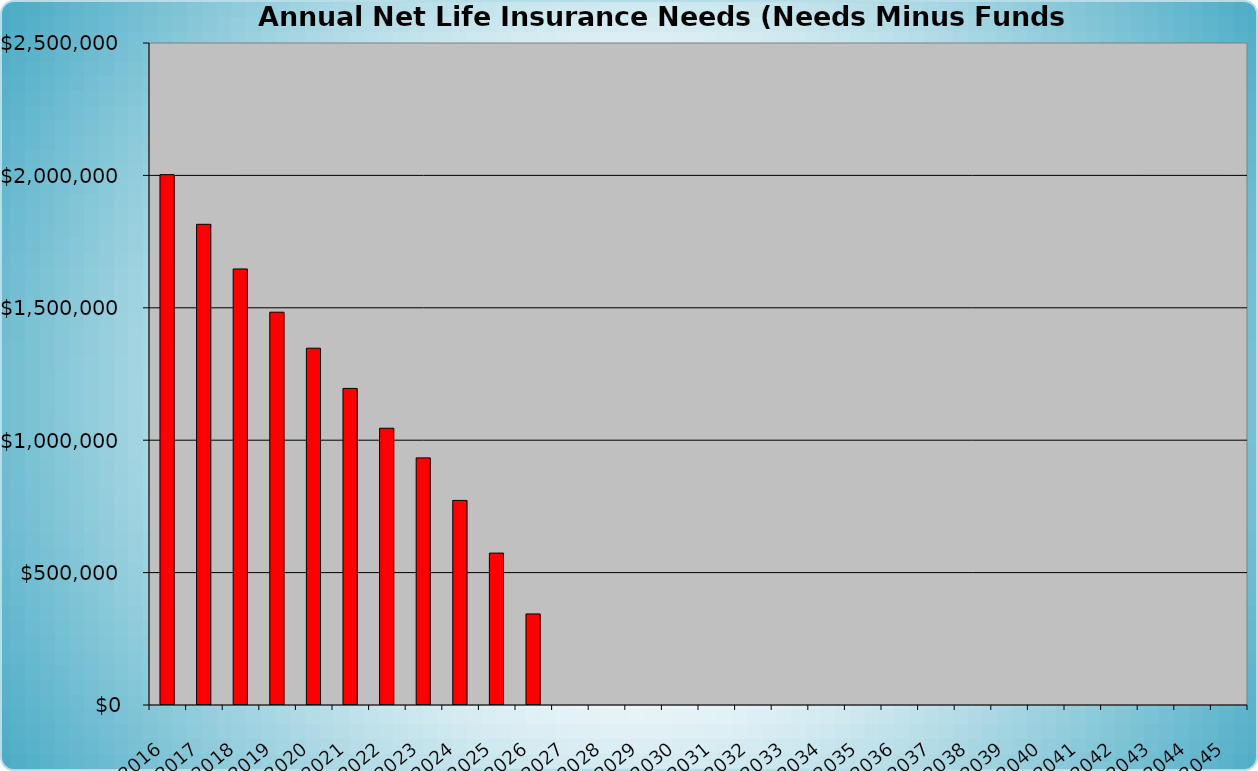
| Category | Total Net Amount of Life Insurance Needed |
|---|---|
| 2016.0 | 2002760.914 |
| 2017.0 | 1815315.616 |
| 2018.0 | 1646609.102 |
| 2019.0 | 1483334.218 |
| 2020.0 | 1347400.589 |
| 2021.0 | 1195586.778 |
| 2022.0 | 1045135.803 |
| 2023.0 | 933243.865 |
| 2024.0 | 772586.486 |
| 2025.0 | 573654.525 |
| 2026.0 | 343847.096 |
| 2027.0 | 0 |
| 2028.0 | 0 |
| 2029.0 | 0 |
| 2030.0 | 0 |
| 2031.0 | 0 |
| 2032.0 | 0 |
| 2033.0 | 0 |
| 2034.0 | 0 |
| 2035.0 | 0 |
| 2036.0 | 0 |
| 2037.0 | 0 |
| 2038.0 | 0 |
| 2039.0 | 0 |
| 2040.0 | 0 |
| 2041.0 | 0 |
| 2042.0 | 0 |
| 2043.0 | 0 |
| 2044.0 | 0 |
| 2045.0 | 0 |